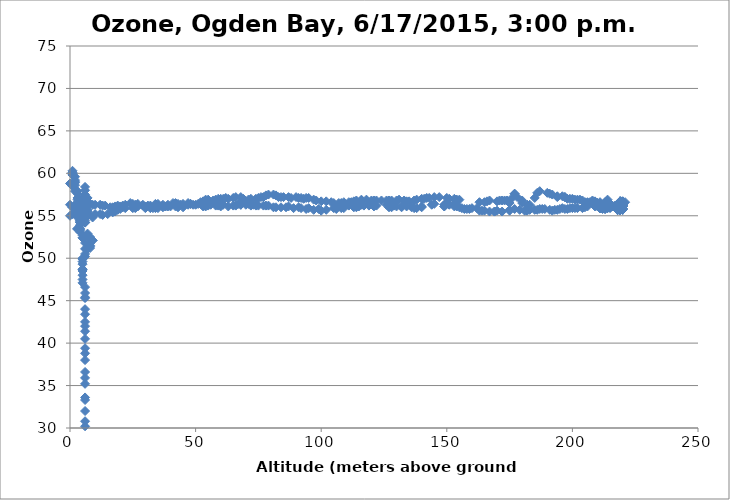
| Category | Series 0 |
|---|---|
| 6.0 | 58.4 |
| 6.0 | 58 |
| 6.0 | 57.5 |
| 6.0 | 57.1 |
| 6.0 | 57 |
| 5.0 | 56.9 |
| 5.0 | 56.8 |
| 5.0 | 56.5 |
| 5.0 | 56.2 |
| 5.0 | 56 |
| 5.0 | 55.9 |
| 6.0 | 55.8 |
| 7.0 | 55.7 |
| 7.0 | 55.5 |
| 7.0 | 55.4 |
| 7.0 | 55.2 |
| 5.0 | 55.2 |
| 6.0 | 54.7 |
| 6.0 | 54.4 |
| 6.0 | 54.2 |
| 6.0 | 54.2 |
| 6.0 | 54.2 |
| 6.0 | 51.8 |
| 5.0 | 48.7 |
| 6.0 | 45.4 |
| 6.0 | 42 |
| 6.0 | 38.8 |
| 6.0 | 35.9 |
| 6.0 | 33.3 |
| 6.0 | 30.8 |
| 6.0 | 28.7 |
| 6.0 | 26.6 |
| 6.0 | 24.8 |
| 6.0 | 23.1 |
| 6.0 | 21.5 |
| 6.0 | 20.1 |
| 6.0 | 18.8 |
| 6.0 | 17.8 |
| 6.0 | 16.7 |
| 6.0 | 15.8 |
| 6.0 | 14.9 |
| 6.0 | 14.1 |
| 6.0 | 13.4 |
| 6.0 | 12.8 |
| 6.0 | 12.1 |
| 6.0 | 11.5 |
| 6.0 | 11 |
| 6.0 | 10.6 |
| 6.0 | 10.2 |
| 6.0 | 9.8 |
| 7.0 | 9.4 |
| 5.0 | 9.2 |
| 5.0 | 8.3 |
| 6.0 | 8 |
| 6.0 | 7.7 |
| 7.0 | 7.5 |
| 8.0 | 7.3 |
| 8.0 | 7.1 |
| 8.0 | 6.9 |
| 8.0 | 6.7 |
| 7.0 | 6.6 |
| 6.0 | 6.5 |
| 6.0 | 6.3 |
| 5.0 | 6.2 |
| 5.0 | 6.1 |
| 5.0 | 6 |
| 5.0 | 5.9 |
| 4.0 | 5.8 |
| 4.0 | 5.7 |
| 4.0 | 5.6 |
| 4.0 | 5.6 |
| 4.0 | 5.5 |
| 5.0 | 5.4 |
| 4.0 | 5.3 |
| 4.0 | 5.3 |
| 6.0 | 5.2 |
| 7.0 | 5.2 |
| 7.0 | 5.2 |
| 7.0 | 5.1 |
| 7.0 | 5 |
| 7.0 | 5 |
| 7.0 | 4.9 |
| 7.0 | 4.9 |
| 8.0 | 4.9 |
| 7.0 | 4.8 |
| 7.0 | 4.8 |
| 7.0 | 4.8 |
| 7.0 | 4.8 |
| 7.0 | 4.8 |
| 7.0 | 4.8 |
| 8.0 | 4.7 |
| 8.0 | 4.7 |
| 8.0 | 4.7 |
| 8.0 | 4.7 |
| 8.0 | 4.6 |
| 8.0 | 4.5 |
| 8.0 | 4.5 |
| 8.0 | 4.5 |
| 8.0 | 4.5 |
| 8.0 | 4.5 |
| 8.0 | 4.5 |
| 8.0 | 4.5 |
| 8.0 | 4.5 |
| 8.0 | 4.5 |
| 8.0 | 4.5 |
| 8.0 | 4.5 |
| 8.0 | 4.5 |
| 8.0 | 4.5 |
| 8.0 | 4.5 |
| 8.0 | 4.5 |
| 8.0 | 4.5 |
| 8.0 | 4.5 |
| 8.0 | 4.5 |
| 8.0 | 4.5 |
| 8.0 | 4.4 |
| 8.0 | 4.4 |
| 8.0 | 4.5 |
| 7.0 | 4.4 |
| 7.0 | 4.5 |
| 7.0 | 4.7 |
| 7.0 | 4.8 |
| 7.0 | 4.8 |
| 6.0 | 4.8 |
| 6.0 | 4.8 |
| 6.0 | 4.8 |
| 6.0 | 4.8 |
| 6.0 | 4.7 |
| 6.0 | 4.6 |
| 6.0 | 4.6 |
| 6.0 | 4.5 |
| 6.0 | 4.5 |
| 6.0 | 4.5 |
| 6.0 | 4.5 |
| 6.0 | 4.5 |
| 6.0 | 4.5 |
| 6.0 | 4.5 |
| 6.0 | 4.5 |
| 6.0 | 4.5 |
| 6.0 | 4.5 |
| 5.0 | 4.5 |
| 6.0 | 4.5 |
| 6.0 | 4.5 |
| 6.0 | 4.5 |
| 6.0 | 4.5 |
| 6.0 | 4.5 |
| 6.0 | 4.5 |
| 6.0 | 4.5 |
| 7.0 | 4.5 |
| 7.0 | 4.5 |
| 7.0 | 4.5 |
| 8.0 | 4.5 |
| 8.0 | 4.5 |
| 8.0 | 4.5 |
| 7.0 | 4.5 |
| 7.0 | 4.4 |
| 7.0 | 4.4 |
| 7.0 | 4.4 |
| 7.0 | 4.4 |
| 7.0 | 4.4 |
| 8.0 | 4.4 |
| 7.0 | 4.4 |
| 7.0 | 4.4 |
| 8.0 | 4.4 |
| 8.0 | 4.4 |
| 7.0 | 4.4 |
| 8.0 | 4.4 |
| 8.0 | 4.4 |
| 7.0 | 4.5 |
| 7.0 | 4.4 |
| 8.0 | 4.4 |
| 7.0 | 4.4 |
| 7.0 | 4.4 |
| 7.0 | 4.4 |
| 7.0 | 4.4 |
| 7.0 | 4.4 |
| 7.0 | 4.4 |
| 7.0 | 4.4 |
| 7.0 | 4.4 |
| 7.0 | 4.4 |
| 8.0 | 4.4 |
| 8.0 | 4.4 |
| 8.0 | 4.4 |
| 8.0 | 4.4 |
| 8.0 | 4.4 |
| 8.0 | 4.4 |
| 8.0 | 4.4 |
| 8.0 | 4.4 |
| 8.0 | 4.4 |
| 8.0 | 4.4 |
| 8.0 | 4.4 |
| 8.0 | 4.4 |
| 8.0 | 4.4 |
| 9.0 | 4.4 |
| 9.0 | 4.4 |
| 9.0 | 4.4 |
| 8.0 | 4.4 |
| 8.0 | 4.4 |
| 8.0 | 4.5 |
| 8.0 | 4.5 |
| 8.0 | 4.5 |
| 8.0 | 4.4 |
| 8.0 | 4.5 |
| 8.0 | 4.5 |
| 8.0 | 4.5 |
| 8.0 | 4.5 |
| 8.0 | 4.5 |
| 8.0 | 4.5 |
| 8.0 | 4.5 |
| 8.0 | 4.5 |
| 8.0 | 4.5 |
| 8.0 | 4.5 |
| 8.0 | 4.5 |
| 8.0 | 4.5 |
| 7.0 | 4.5 |
| 7.0 | 4.5 |
| 7.0 | 4.5 |
| 7.0 | 4.5 |
| 8.0 | 4.5 |
| 8.0 | 4.5 |
| 8.0 | 4.5 |
| 8.0 | 4.5 |
| 8.0 | 4.5 |
| 8.0 | 4.5 |
| 8.0 | 4.2 |
| 8.0 | 4.2 |
| 7.0 | 4.4 |
| 7.0 | 4.6 |
| 8.0 | 5.3 |
| 8.0 | 8.3 |
| 8.0 | 11.7 |
| 8.0 | 15 |
| 8.0 | 15 |
| 7.0 | 21 |
| 7.0 | 23.7 |
| 7.0 | 26.1 |
| 6.0 | 28.2 |
| 6.0 | 30.2 |
| 6.0 | 32 |
| 6.0 | 33.6 |
| 6.0 | 35.2 |
| 6.0 | 36.6 |
| 6.0 | 38 |
| 6.0 | 39.4 |
| 6.0 | 40.5 |
| 6.0 | 41.4 |
| 6.0 | 42.5 |
| 6.0 | 43.4 |
| 6.0 | 44 |
| 6.0 | 45.3 |
| 6.0 | 45.9 |
| 6.0 | 46.6 |
| 5.0 | 47.1 |
| 5.0 | 47.5 |
| 5.0 | 48 |
| 5.0 | 48.5 |
| 5.0 | 48.7 |
| 5.0 | 49.3 |
| 5.0 | 49.6 |
| 5.0 | 49.9 |
| 5.0 | 50 |
| 6.0 | 50.2 |
| 6.0 | 50.5 |
| 6.0 | 51.1 |
| 7.0 | 51.1 |
| 8.0 | 51.2 |
| 8.0 | 51.4 |
| 8.0 | 51.5 |
| 8.0 | 51.8 |
| 9.0 | 52.1 |
| 9.0 | 52.1 |
| 8.0 | 52.3 |
| 8.0 | 52.5 |
| 7.0 | 52.9 |
| 6.0 | 52.5 |
| 5.0 | 52.4 |
| 5.0 | 52.4 |
| 5.0 | 52.7 |
| 4.0 | 53.1 |
| 4.0 | 53.3 |
| 3.0 | 53.5 |
| 3.0 | 53.5 |
| 3.0 | 53.4 |
| 4.0 | 53.4 |
| 4.0 | 53.5 |
| 4.0 | 53.9 |
| 4.0 | 54.2 |
| 4.0 | 54.2 |
| 4.0 | 54.3 |
| 4.0 | 54.7 |
| 4.0 | 54.9 |
| 4.0 | 54.9 |
| 4.0 | 54.7 |
| 4.0 | 54.6 |
| 4.0 | 54.5 |
| 4.0 | 54.4 |
| 4.0 | 54.5 |
| 5.0 | 54.7 |
| 4.0 | 55.3 |
| 4.0 | 55.6 |
| 4.0 | 55.5 |
| 4.0 | 55.4 |
| 4.0 | 55.5 |
| 4.0 | 55.4 |
| 4.0 | 55.5 |
| 4.0 | 55.5 |
| 4.0 | 55.6 |
| 6.0 | 55.6 |
| 6.0 | 56 |
| 6.0 | 56.1 |
| 6.0 | 56.6 |
| 6.0 | 57.1 |
| 5.0 | 57 |
| 5.0 | 56.8 |
| 4.0 | 56.9 |
| 5.0 | 56.8 |
| 6.0 | 56.4 |
| 6.0 | 56.4 |
| 6.0 | 55.9 |
| 5.0 | 55.5 |
| 5.0 | 55.6 |
| 5.0 | 55.7 |
| 4.0 | 55.9 |
| 4.0 | 56.2 |
| 4.0 | 56.1 |
| 4.0 | 56.2 |
| 4.0 | 56.4 |
| 3.0 | 56.3 |
| 3.0 | 56.3 |
| 3.0 | 56 |
| 3.0 | 56.1 |
| 3.0 | 56 |
| 3.0 | 56 |
| 2.0 | 56.1 |
| 3.0 | 56.3 |
| 3.0 | 56.2 |
| 4.0 | 56.2 |
| 4.0 | 56 |
| 4.0 | 56 |
| 4.0 | 55.9 |
| 4.0 | 55.9 |
| 4.0 | 55.6 |
| 4.0 | 55.5 |
| 4.0 | 55.6 |
| 4.0 | 55.6 |
| 4.0 | 55.6 |
| 4.0 | 55.7 |
| 4.0 | 55.6 |
| 4.0 | 55.6 |
| 4.0 | 55.7 |
| 4.0 | 55.9 |
| 4.0 | 56 |
| 4.0 | 56 |
| 4.0 | 56 |
| 4.0 | 55.9 |
| 5.0 | 55.9 |
| 5.0 | 55.9 |
| 5.0 | 55.6 |
| 5.0 | 55.6 |
| 5.0 | 55.7 |
| 5.0 | 55.7 |
| 5.0 | 55.6 |
| 4.0 | 55.7 |
| 4.0 | 55.6 |
| 4.0 | 55.4 |
| 4.0 | 55.4 |
| 4.0 | 55.2 |
| 4.0 | 55.1 |
| 4.0 | 55 |
| 4.0 | 55 |
| 4.0 | 54.8 |
| 4.0 | 54.8 |
| 5.0 | 54.8 |
| 6.0 | 55.9 |
| 7.0 | 55.2 |
| 9.0 | 54.8 |
| 10.0 | 55.2 |
| 12.0 | 55.2 |
| 13.0 | 55.1 |
| 15.0 | 55.2 |
| 17.0 | 55.4 |
| 18.0 | 55.5 |
| 19.0 | 55.7 |
| 20.0 | 55.8 |
| 21.0 | 56 |
| 22.0 | 55.9 |
| 25.0 | 55.9 |
| 26.0 | 55.9 |
| 27.0 | 56.1 |
| 29.0 | 56.2 |
| 30.0 | 55.9 |
| 32.0 | 55.9 |
| 33.0 | 55.9 |
| 34.0 | 55.9 |
| 35.0 | 55.9 |
| 37.0 | 56 |
| 38.0 | 56.1 |
| 39.0 | 56.3 |
| 41.0 | 56.5 |
| 42.0 | 56.5 |
| 43.0 | 56.4 |
| 44.0 | 56.3 |
| 45.0 | 56.4 |
| 47.0 | 56.5 |
| 48.0 | 56.4 |
| 51.0 | 56.4 |
| 52.0 | 56.6 |
| 53.0 | 56.7 |
| 54.0 | 56.9 |
| 55.0 | 56.9 |
| 57.0 | 56.8 |
| 58.0 | 56.9 |
| 59.0 | 57 |
| 60.0 | 57 |
| 61.0 | 57 |
| 62.0 | 57.1 |
| 63.0 | 57 |
| 65.0 | 57.1 |
| 66.0 | 57.2 |
| 68.0 | 57.2 |
| 69.0 | 57 |
| 71.0 | 56.9 |
| 72.0 | 57 |
| 74.0 | 57 |
| 75.0 | 57.1 |
| 76.0 | 57.2 |
| 77.0 | 57.2 |
| 78.0 | 57.4 |
| 79.0 | 57.5 |
| 81.0 | 57.5 |
| 82.0 | 57.4 |
| 83.0 | 57.2 |
| 84.0 | 57.2 |
| 85.0 | 57.2 |
| 87.0 | 57.2 |
| 88.0 | 57.1 |
| 90.0 | 57.2 |
| 91.0 | 57.1 |
| 92.0 | 57.1 |
| 93.0 | 57 |
| 94.0 | 57.1 |
| 95.0 | 57.1 |
| 97.0 | 56.9 |
| 98.0 | 56.8 |
| 100.0 | 56.7 |
| 102.0 | 56.7 |
| 104.0 | 56.6 |
| 105.0 | 56.5 |
| 107.0 | 56.5 |
| 108.0 | 56.5 |
| 109.0 | 56.6 |
| 111.0 | 56.6 |
| 112.0 | 56.6 |
| 113.0 | 56.7 |
| 114.0 | 56.8 |
| 116.0 | 56.8 |
| 116.0 | 56.9 |
| 118.0 | 56.9 |
| 120.0 | 56.8 |
| 121.0 | 56.8 |
| 122.0 | 56.8 |
| 124.0 | 56.8 |
| 126.0 | 56.8 |
| 127.0 | 56.8 |
| 128.0 | 56.8 |
| 130.0 | 56.8 |
| 131.0 | 56.9 |
| 133.0 | 56.8 |
| 134.0 | 56.7 |
| 135.0 | 56.7 |
| 137.0 | 56.8 |
| 138.0 | 56.9 |
| 140.0 | 57 |
| 141.0 | 57 |
| 142.0 | 57.1 |
| 143.0 | 57.1 |
| 145.0 | 57.2 |
| 147.0 | 57.2 |
| 150.0 | 57.1 |
| 151.0 | 57 |
| 153.0 | 57 |
| 154.0 | 56.9 |
| 155.0 | 56.9 |
| 163.0 | 56.6 |
| 165.0 | 56.6 |
| 166.0 | 56.7 |
| 167.0 | 56.8 |
| 170.0 | 56.7 |
| 171.0 | 56.8 |
| 172.0 | 56.8 |
| 173.0 | 56.8 |
| 174.0 | 56.8 |
| 175.0 | 56.5 |
| 176.0 | 57.1 |
| 177.0 | 57.6 |
| 177.0 | 57.6 |
| 178.0 | 57.2 |
| 180.0 | 56.8 |
| 180.0 | 56.5 |
| 182.0 | 56.3 |
| 183.0 | 56.3 |
| 185.0 | 57.1 |
| 186.0 | 57.7 |
| 187.0 | 57.9 |
| 190.0 | 57.7 |
| 191.0 | 57.6 |
| 192.0 | 57.5 |
| 194.0 | 57.3 |
| 194.0 | 57.2 |
| 196.0 | 57.3 |
| 197.0 | 57.2 |
| 197.0 | 57.2 |
| 198.0 | 57 |
| 199.0 | 57 |
| 200.0 | 57 |
| 201.0 | 56.9 |
| 202.0 | 56.9 |
| 203.0 | 56.9 |
| 204.0 | 56.8 |
| 205.0 | 56.6 |
| 206.0 | 56.6 |
| 207.0 | 56.6 |
| 208.0 | 56.8 |
| 209.0 | 56.7 |
| 209.0 | 56.2 |
| 209.0 | 56.2 |
| 209.0 | 56.5 |
| 209.0 | 56.6 |
| 209.0 | 56.6 |
| 209.0 | 56.6 |
| 209.0 | 56.6 |
| 208.0 | 56.7 |
| 208.0 | 56.6 |
| 208.0 | 56.6 |
| 208.0 | 56.5 |
| 208.0 | 56.5 |
| 208.0 | 56.5 |
| 209.0 | 56.4 |
| 209.0 | 56.4 |
| 209.0 | 56.4 |
| 209.0 | 56.4 |
| 209.0 | 56.4 |
| 210.0 | 56.5 |
| 210.0 | 56.5 |
| 210.0 | 56.3 |
| 210.0 | 56.2 |
| 210.0 | 56.2 |
| 210.0 | 56.1 |
| 211.0 | 56 |
| 211.0 | 56 |
| 211.0 | 56 |
| 211.0 | 55.9 |
| 211.0 | 55.9 |
| 211.0 | 55.9 |
| 211.0 | 55.9 |
| 211.0 | 55.9 |
| 211.0 | 55.9 |
| 211.0 | 55.9 |
| 211.0 | 55.9 |
| 211.0 | 55.9 |
| 211.0 | 55.9 |
| 211.0 | 55.9 |
| 211.0 | 55.9 |
| 212.0 | 55.9 |
| 212.0 | 56 |
| 212.0 | 55.9 |
| 212.0 | 56 |
| 212.0 | 56 |
| 212.0 | 56 |
| 212.0 | 56.1 |
| 212.0 | 56.1 |
| 212.0 | 56.2 |
| 212.0 | 56.3 |
| 212.0 | 56.3 |
| 212.0 | 56.3 |
| 213.0 | 56.3 |
| 213.0 | 56.3 |
| 213.0 | 56.3 |
| 214.0 | 56.3 |
| 214.0 | 56.3 |
| 214.0 | 56.3 |
| 214.0 | 56.3 |
| 214.0 | 56.3 |
| 214.0 | 56.3 |
| 214.0 | 56.3 |
| 214.0 | 56.3 |
| 215.0 | 56.3 |
| 215.0 | 56.3 |
| 214.0 | 56.5 |
| 215.0 | 56.4 |
| 215.0 | 56.4 |
| 215.0 | 56.4 |
| 215.0 | 56.4 |
| 215.0 | 56.3 |
| 215.0 | 56.3 |
| 215.0 | 56.3 |
| 215.0 | 56.3 |
| 215.0 | 56.3 |
| 215.0 | 56.3 |
| 215.0 | 56.2 |
| 215.0 | 56.2 |
| 215.0 | 56.1 |
| 215.0 | 56.1 |
| 215.0 | 56.1 |
| 215.0 | 56.1 |
| 216.0 | 56.1 |
| 216.0 | 56.1 |
| 216.0 | 56.1 |
| 216.0 | 56.1 |
| 217.0 | 56.1 |
| 217.0 | 56.1 |
| 217.0 | 56.1 |
| 217.0 | 56.1 |
| 217.0 | 56.1 |
| 217.0 | 56.2 |
| 217.0 | 56.1 |
| 218.0 | 56.1 |
| 218.0 | 56.2 |
| 218.0 | 56.2 |
| 218.0 | 56.2 |
| 218.0 | 56.3 |
| 219.0 | 56.3 |
| 219.0 | 56.3 |
| 219.0 | 56.3 |
| 219.0 | 56.4 |
| 219.0 | 56.3 |
| 219.0 | 56.3 |
| 219.0 | 56.4 |
| 219.0 | 56.5 |
| 219.0 | 56.5 |
| 219.0 | 56.4 |
| 219.0 | 56.3 |
| 219.0 | 56.3 |
| 220.0 | 56.3 |
| 220.0 | 56.4 |
| 220.0 | 56.4 |
| 220.0 | 56.4 |
| 220.0 | 56.4 |
| 220.0 | 56.4 |
| 220.0 | 56.4 |
| 220.0 | 56.3 |
| 220.0 | 56.3 |
| 220.0 | 56.2 |
| 220.0 | 56.2 |
| 220.0 | 56.2 |
| 220.0 | 56.2 |
| 220.0 | 56.2 |
| 219.0 | 56.2 |
| 219.0 | 56 |
| 219.0 | 55.9 |
| 220.0 | 55.8 |
| 219.0 | 55.8 |
| 219.0 | 55.7 |
| 219.0 | 55.7 |
| 219.0 | 55.7 |
| 219.0 | 55.7 |
| 219.0 | 55.9 |
| 219.0 | 55.9 |
| 219.0 | 55.8 |
| 220.0 | 55.8 |
| 220.0 | 55.8 |
| 220.0 | 55.8 |
| 220.0 | 55.7 |
| 220.0 | 55.7 |
| 220.0 | 55.7 |
| 220.0 | 55.8 |
| 220.0 | 55.8 |
| 220.0 | 55.9 |
| 220.0 | 55.9 |
| 219.0 | 55.9 |
| 219.0 | 55.9 |
| 219.0 | 55.9 |
| 219.0 | 55.9 |
| 219.0 | 55.9 |
| 219.0 | 55.9 |
| 219.0 | 55.9 |
| 219.0 | 55.9 |
| 219.0 | 55.9 |
| 219.0 | 55.9 |
| 219.0 | 55.9 |
| 219.0 | 55.9 |
| 219.0 | 55.9 |
| 219.0 | 55.9 |
| 219.0 | 56 |
| 219.0 | 56 |
| 219.0 | 56 |
| 219.0 | 56.1 |
| 219.0 | 56.1 |
| 219.0 | 56.1 |
| 219.0 | 56.3 |
| 219.0 | 56.3 |
| 219.0 | 56.3 |
| 219.0 | 56.5 |
| 219.0 | 56.5 |
| 220.0 | 56.5 |
| 220.0 | 56.6 |
| 220.0 | 56.6 |
| 220.0 | 56.6 |
| 220.0 | 56.6 |
| 220.0 | 56.6 |
| 219.0 | 56.6 |
| 219.0 | 56.6 |
| 219.0 | 56.6 |
| 219.0 | 56.6 |
| 220.0 | 56.6 |
| 220.0 | 56.6 |
| 220.0 | 56.6 |
| 220.0 | 56.6 |
| 220.0 | 56.6 |
| 221.0 | 56.6 |
| 220.0 | 56.6 |
| 220.0 | 56.6 |
| 220.0 | 56.6 |
| 220.0 | 56.7 |
| 219.0 | 56.7 |
| 219.0 | 56.7 |
| 219.0 | 56.7 |
| 219.0 | 56.7 |
| 219.0 | 56.7 |
| 219.0 | 56.6 |
| 220.0 | 56.6 |
| 220.0 | 56.6 |
| 220.0 | 56.6 |
| 220.0 | 56.6 |
| 220.0 | 56.6 |
| 220.0 | 56.7 |
| 220.0 | 56.6 |
| 220.0 | 56.6 |
| 220.0 | 56.6 |
| 220.0 | 56.6 |
| 220.0 | 56.6 |
| 220.0 | 56.4 |
| 220.0 | 56.3 |
| 220.0 | 56.3 |
| 220.0 | 56.4 |
| 219.0 | 56.4 |
| 218.0 | 56.4 |
| 219.0 | 56.4 |
| 219.0 | 56.4 |
| 219.0 | 56.3 |
| 219.0 | 56.3 |
| 219.0 | 56.3 |
| 219.0 | 56.3 |
| 219.0 | 56.3 |
| 219.0 | 56.2 |
| 219.0 | 56.2 |
| 218.0 | 56.2 |
| 219.0 | 56.3 |
| 219.0 | 56.3 |
| 219.0 | 56.3 |
| 218.0 | 56.4 |
| 218.0 | 56.4 |
| 218.0 | 56.4 |
| 219.0 | 56.5 |
| 219.0 | 56.5 |
| 219.0 | 56.5 |
| 219.0 | 56.4 |
| 219.0 | 56.3 |
| 219.0 | 56.3 |
| 219.0 | 56.3 |
| 219.0 | 56.3 |
| 219.0 | 56.2 |
| 219.0 | 56.2 |
| 219.0 | 56.3 |
| 219.0 | 56.3 |
| 219.0 | 56.2 |
| 219.0 | 56.1 |
| 220.0 | 56.2 |
| 220.0 | 56.2 |
| 220.0 | 56.2 |
| 220.0 | 56.1 |
| 220.0 | 56.1 |
| 220.0 | 56.1 |
| 220.0 | 56.1 |
| 219.0 | 56.1 |
| 219.0 | 56.1 |
| 220.0 | 56.1 |
| 219.0 | 56.1 |
| 219.0 | 56.1 |
| 219.0 | 56.1 |
| 218.0 | 56 |
| 218.0 | 55.9 |
| 219.0 | 55.9 |
| 219.0 | 55.9 |
| 219.0 | 55.9 |
| 219.0 | 55.8 |
| 219.0 | 55.8 |
| 219.0 | 55.8 |
| 219.0 | 55.8 |
| 220.0 | 55.8 |
| 220.0 | 55.8 |
| 219.0 | 55.8 |
| 219.0 | 55.8 |
| 219.0 | 55.8 |
| 219.0 | 55.7 |
| 220.0 | 55.8 |
| 220.0 | 55.8 |
| 219.0 | 55.8 |
| 219.0 | 55.8 |
| 219.0 | 55.8 |
| 219.0 | 55.7 |
| 218.0 | 55.7 |
| 218.0 | 55.7 |
| 219.0 | 55.7 |
| 219.0 | 55.7 |
| 219.0 | 55.7 |
| 219.0 | 55.7 |
| 219.0 | 55.7 |
| 219.0 | 55.7 |
| 219.0 | 55.7 |
| 219.0 | 55.7 |
| 219.0 | 55.8 |
| 219.0 | 55.8 |
| 218.0 | 55.8 |
| 218.0 | 55.7 |
| 219.0 | 55.7 |
| 219.0 | 55.7 |
| 219.0 | 55.8 |
| 219.0 | 55.8 |
| 219.0 | 55.8 |
| 218.0 | 55.7 |
| 218.0 | 55.8 |
| 218.0 | 55.7 |
| 219.0 | 55.7 |
| 219.0 | 55.8 |
| 218.0 | 55.8 |
| 218.0 | 55.7 |
| 218.0 | 55.8 |
| 218.0 | 55.8 |
| 218.0 | 55.9 |
| 218.0 | 55.9 |
| 218.0 | 55.9 |
| 218.0 | 55.9 |
| 218.0 | 56 |
| 217.0 | 56 |
| 217.0 | 56 |
| 217.0 | 56 |
| 217.0 | 56 |
| 217.0 | 56 |
| 216.0 | 56.1 |
| 216.0 | 56.1 |
| 216.0 | 56.1 |
| 216.0 | 56.1 |
| 215.0 | 56.2 |
| 215.0 | 56.2 |
| 215.0 | 56.2 |
| 215.0 | 56.1 |
| 215.0 | 56.1 |
| 215.0 | 56.1 |
| 215.0 | 56.1 |
| 215.0 | 56 |
| 214.0 | 56 |
| 213.0 | 56 |
| 213.0 | 55.9 |
| 213.0 | 55.9 |
| 212.0 | 55.9 |
| 212.0 | 56 |
| 212.0 | 56 |
| 212.0 | 56.1 |
| 212.0 | 56 |
| 212.0 | 55.9 |
| 212.0 | 55.8 |
| 213.0 | 55.9 |
| 213.0 | 55.8 |
| 213.0 | 55.8 |
| 213.0 | 56 |
| 213.0 | 56 |
| 213.0 | 56 |
| 213.0 | 56 |
| 214.0 | 56 |
| 214.0 | 56 |
| 214.0 | 56 |
| 214.0 | 55.9 |
| 214.0 | 55.9 |
| 215.0 | 55.9 |
| 215.0 | 56 |
| 215.0 | 56 |
| 215.0 | 56.4 |
| 214.0 | 56.9 |
| 214.0 | 56.6 |
| 214.0 | 56.2 |
| 214.0 | 56.2 |
| 214.0 | 56.1 |
| 214.0 | 56.1 |
| 213.0 | 56.6 |
| 211.0 | 56.6 |
| 211.0 | 56.4 |
| 209.0 | 56.2 |
| 209.0 | 56.1 |
| 206.0 | 56.1 |
| 205.0 | 56 |
| 204.0 | 55.9 |
| 202.0 | 55.9 |
| 201.0 | 55.9 |
| 200.0 | 55.9 |
| 199.0 | 55.9 |
| 198.0 | 55.8 |
| 197.0 | 55.8 |
| 196.0 | 55.9 |
| 195.0 | 55.8 |
| 194.0 | 55.7 |
| 193.0 | 55.7 |
| 192.0 | 55.6 |
| 191.0 | 55.7 |
| 189.0 | 55.8 |
| 188.0 | 55.8 |
| 187.0 | 55.8 |
| 186.0 | 55.7 |
| 185.0 | 55.7 |
| 183.0 | 55.7 |
| 182.0 | 55.6 |
| 181.0 | 55.6 |
| 179.0 | 55.7 |
| 177.0 | 55.8 |
| 175.0 | 55.7 |
| 175.0 | 55.6 |
| 172.0 | 55.5 |
| 170.0 | 55.6 |
| 169.0 | 55.5 |
| 169.0 | 55.5 |
| 167.0 | 55.5 |
| 165.0 | 55.6 |
| 164.0 | 55.6 |
| 163.0 | 55.6 |
| 162.0 | 55.9 |
| 160.0 | 55.9 |
| 159.0 | 55.8 |
| 158.0 | 55.8 |
| 157.0 | 55.8 |
| 156.0 | 55.9 |
| 155.0 | 56 |
| 154.0 | 56.1 |
| 153.0 | 56.1 |
| 153.0 | 56.4 |
| 151.0 | 56.3 |
| 150.0 | 56.4 |
| 149.0 | 56.1 |
| 149.0 | 56.1 |
| 149.0 | 56.3 |
| 149.0 | 56.3 |
| 145.0 | 56.4 |
| 144.0 | 56.3 |
| 140.0 | 56.1 |
| 140.0 | 56 |
| 138.0 | 55.9 |
| 137.0 | 55.9 |
| 136.0 | 56 |
| 134.0 | 56.1 |
| 132.0 | 56 |
| 132.0 | 56.1 |
| 130.0 | 56.1 |
| 129.0 | 56.2 |
| 128.0 | 56 |
| 127.0 | 56 |
| 126.0 | 56.3 |
| 122.0 | 56.2 |
| 121.0 | 56.1 |
| 119.0 | 56.2 |
| 117.0 | 56.2 |
| 116.0 | 56.3 |
| 115.0 | 56.1 |
| 114.0 | 56 |
| 113.0 | 56 |
| 111.0 | 56.2 |
| 109.0 | 55.9 |
| 108.0 | 55.9 |
| 106.0 | 55.8 |
| 105.0 | 55.9 |
| 102.0 | 55.7 |
| 100.0 | 55.6 |
| 99.0 | 55.8 |
| 97.0 | 55.7 |
| 95.0 | 55.9 |
| 94.0 | 55.8 |
| 92.0 | 55.9 |
| 91.0 | 56 |
| 89.0 | 55.9 |
| 87.0 | 56.1 |
| 86.0 | 56 |
| 84.0 | 56 |
| 82.0 | 56 |
| 81.0 | 56 |
| 79.0 | 56.2 |
| 78.0 | 56.2 |
| 77.0 | 56.2 |
| 75.0 | 56.2 |
| 74.0 | 56.2 |
| 73.0 | 56.3 |
| 72.0 | 56.2 |
| 71.0 | 56.4 |
| 70.0 | 56.3 |
| 68.0 | 56.3 |
| 68.0 | 56.3 |
| 67.0 | 56.4 |
| 66.0 | 56.2 |
| 65.0 | 56.2 |
| 63.0 | 56.1 |
| 61.0 | 56.3 |
| 60.0 | 56.1 |
| 59.0 | 56.2 |
| 58.0 | 56.2 |
| 56.0 | 56.3 |
| 55.0 | 56.2 |
| 54.0 | 56.1 |
| 53.0 | 56.1 |
| 52.0 | 56.4 |
| 50.0 | 56.3 |
| 49.0 | 56.3 |
| 48.0 | 56.4 |
| 47.0 | 56.3 |
| 45.0 | 56 |
| 43.0 | 56 |
| 42.0 | 56.1 |
| 40.0 | 56.1 |
| 39.0 | 56.1 |
| 38.0 | 56.1 |
| 37.0 | 56.3 |
| 35.0 | 56.4 |
| 34.0 | 56.4 |
| 32.0 | 56.2 |
| 31.0 | 56.2 |
| 30.0 | 56.1 |
| 29.0 | 56.3 |
| 27.0 | 56.4 |
| 26.0 | 56.3 |
| 25.0 | 56.4 |
| 24.0 | 56.5 |
| 22.0 | 56.3 |
| 21.0 | 56.2 |
| 20.0 | 56.1 |
| 19.0 | 56.2 |
| 18.0 | 56.1 |
| 17.0 | 56 |
| 16.0 | 56 |
| 14.0 | 56.2 |
| 13.0 | 56.2 |
| 12.0 | 56.3 |
| 10.0 | 56.3 |
| 9.0 | 56.3 |
| 8.0 | 56.4 |
| 7.0 | 56.5 |
| 7.0 | 56.7 |
| 7.0 | 57.1 |
| 7.0 | 56.4 |
| 6.0 | 55.9 |
| 6.0 | 55.7 |
| 6.0 | 55.6 |
| 6.0 | 55.7 |
| 6.0 | 55.6 |
| 5.0 | 55.2 |
| 5.0 | 55.2 |
| 5.0 | 55.5 |
| 5.0 | 55.5 |
| 5.0 | 55.3 |
| 5.0 | 55.2 |
| 5.0 | 55.3 |
| 4.0 | 55.3 |
| 4.0 | 55.6 |
| 4.0 | 55.5 |
| 4.0 | 55.2 |
| 4.0 | 55.2 |
| 3.0 | 55.3 |
| 3.0 | 55.3 |
| 3.0 | 55.4 |
| 3.0 | 55.5 |
| 3.0 | 55.5 |
| 3.0 | 55.3 |
| 3.0 | 55.1 |
| 3.0 | 55.3 |
| 3.0 | 55.3 |
| 3.0 | 55.3 |
| 3.0 | 55.4 |
| 2.0 | 55.1 |
| 2.0 | 55.7 |
| 2.0 | 55.4 |
| 2.0 | 55.9 |
| 1.0 | 55.2 |
| 0.0 | 55 |
| 0.0 | 56.3 |
| 0.0 | 58.8 |
| 1.0 | 58.5 |
| 1.0 | 59.9 |
| 1.0 | 59.8 |
| 1.0 | 60.1 |
| 1.0 | 60.3 |
| 1.0 | 60 |
| 2.0 | 59.6 |
| 2.0 | 59.2 |
| 2.0 | 59 |
| 2.0 | 58.9 |
| 2.0 | 58.6 |
| 2.0 | 57.9 |
| 3.0 | 57.6 |
| 3.0 | 57.9 |
| 3.0 | 57.1 |
| 3.0 | 56.9 |
| 3.0 | 56.6 |
| 4.0 | 56.6 |
| 4.0 | 56.4 |
| 4.0 | 56.3 |
| 5.0 | 56.2 |
| 5.0 | 56.1 |
| 5.0 | 56.4 |
| 5.0 | 56.3 |
| 4.0 | 56.1 |
| 4.0 | 56 |
| 4.0 | 56.2 |
| 4.0 | 56.3 |
| 4.0 | 56.4 |
| 4.0 | 56.6 |
| 4.0 | 56.7 |
| 4.0 | 56.7 |
| 3.0 | 56.4 |
| 3.0 | 56.3 |
| 3.0 | 56.2 |
| 3.0 | 56 |
| 3.0 | 56 |
| 3.0 | 56.2 |
| 3.0 | 56.5 |
| 3.0 | 56.5 |
| 3.0 | 56.3 |
| 2.0 | 56.2 |
| 1.0 | 56 |
| 1.0 | 56 |
| 2.0 | 55.9 |